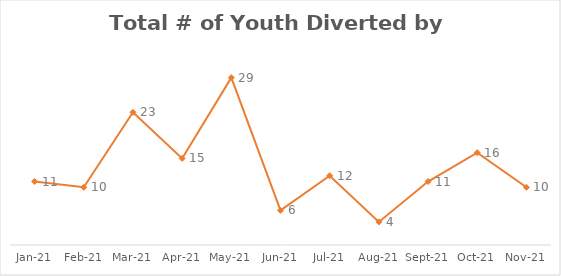
| Category | Series 0 |
|---|---|
| 2021-01-01 | 11 |
| 2021-02-01 | 10 |
| 2021-03-01 | 23 |
| 2021-04-01 | 15 |
| 2021-05-01 | 29 |
| 2021-06-01 | 6 |
| 2021-07-01 | 12 |
| 2021-08-01 | 4 |
| 2021-09-01 | 11 |
| 2021-10-01 | 16 |
| 2021-11-01 | 10 |